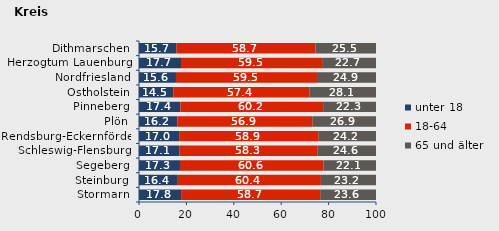
| Category | unter 18 | 18-64 | 65 und älter |
|---|---|---|---|
| Stormarn | 17.775 | 58.672 | 23.553 |
| Steinburg | 16.376 | 60.382 | 23.242 |
| Segeberg | 17.288 | 60.568 | 22.144 |
| Schleswig-Flensburg | 17.119 | 58.282 | 24.598 |
| Rendsburg-Eckernförde | 16.954 | 58.866 | 24.18 |
| Plön | 16.175 | 56.942 | 26.883 |
| Pinneberg | 17.444 | 60.247 | 22.309 |
| Ostholstein | 14.463 | 57.405 | 28.132 |
| Nordfriesland | 15.602 | 59.514 | 24.884 |
| Herzogtum Lauenburg | 17.724 | 59.533 | 22.743 |
| Dithmarschen | 15.74 | 58.729 | 25.531 |